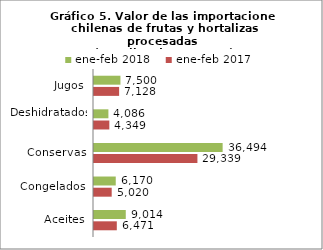
| Category | ene-feb 2017 | ene-feb 2018 |
|---|---|---|
| Aceites | 6471008.61 | 9014144.87 |
| Congelados | 5020274.68 | 6169514.6 |
| Conservas | 29338543.85 | 36494021.73 |
| Deshidratados | 4348749.67 | 4086199.88 |
| Jugos | 7127829.31 | 7500295.8 |